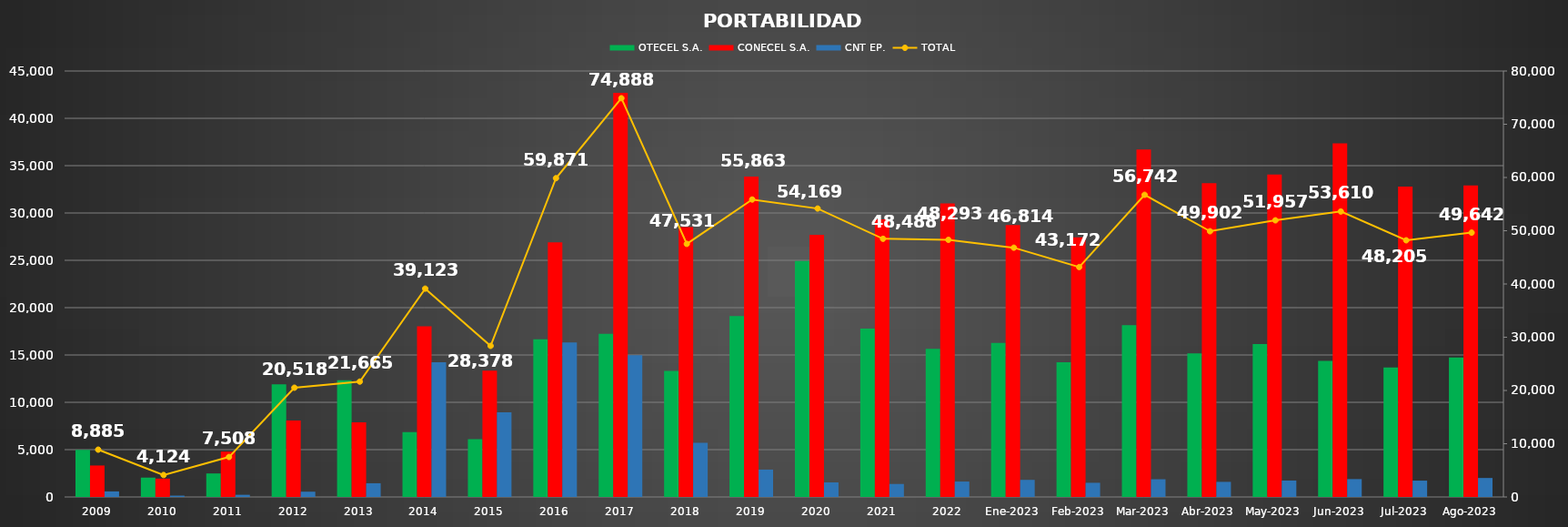
| Category | OTECEL S.A. | CONECEL S.A. | CNT EP. |
|---|---|---|---|
| 2009 | 4973 | 3324 | 588 |
| 2010 | 2045 | 1939 | 140 |
| 2011 | 2484 | 4796 | 228 |
| 2012 | 11894 | 8067 | 557 |
| 2013 | 12323 | 7893 | 1449 |
| 2014 | 6853 | 18039 | 14231 |
| 2015 | 6105 | 13334 | 8939 |
| 2016 | 16653 | 26907 | 16311 |
| 2017 | 17228 | 42694 | 14966 |
| 2018 | 13309 | 28504 | 5718 |
| 2019 | 19116 | 33857 | 2890 |
| 2020 | 24933 | 27700 | 1536 |
| 2021 | 17795 | 29321 | 1372 |
| 2022 | 15655 | 31012 | 1626 |
| Ene-2023 | 16278 | 28730 | 1806 |
| Feb-2023 | 14237 | 27438 | 1497 |
| Mar-2023 | 18159 | 36713 | 1870 |
| Abr-2023 | 15167 | 33140 | 1595 |
| May-2023 | 16147 | 34074 | 1736 |
| Jun-2023 | 14369 | 37353 | 1888 |
| Jul-2023 | 13685 | 32795 | 1725 |
| Ago-2023 | 14739 | 32898 | 2005 |